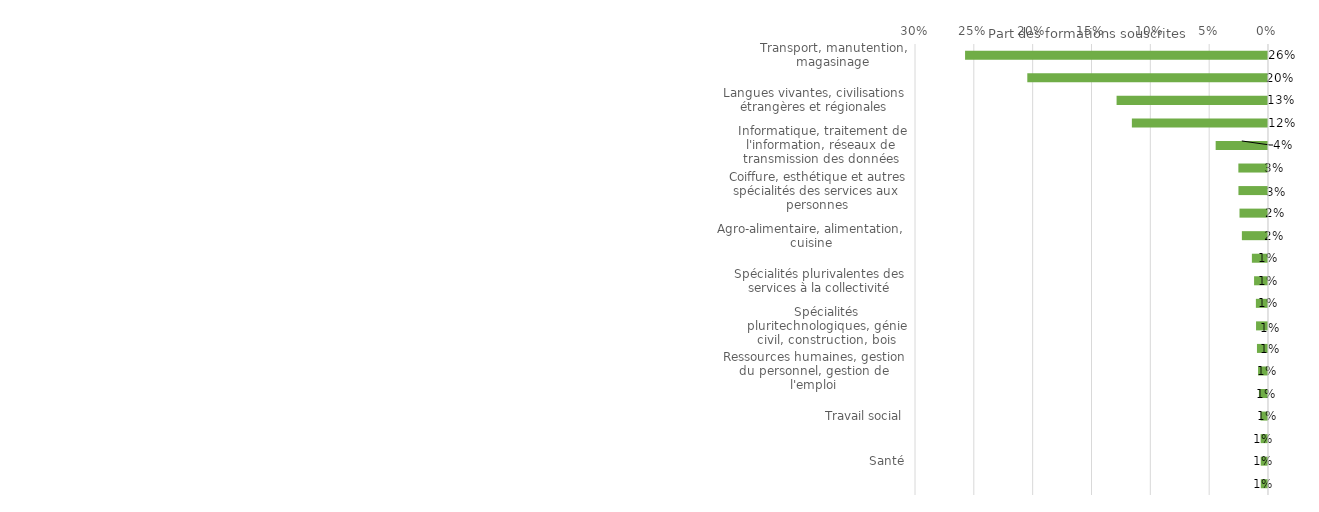
| Category | Series 0 |
|---|---|
| Transport, manutention, magasinage | 0.257 |
| Développement des capacités d'orientation, d'insertion ou de réinsertion | 0.205 |
| Langues vivantes, civilisations étrangères et régionales | 0.129 |
| Secrétariat, bureautique | 0.116 |
| Informatique, traitement de l'information, réseaux de transmission des données | 0.044 |
| Sécurité des biens et des personnes, police, surveillance | 0.025 |
| Coiffure, esthétique et autres spécialités des services aux personnes | 0.025 |
| Enseignement, formation | 0.024 |
| Agro-alimentaire, alimentation, cuisine | 0.022 |
| Spécialités plurivalentes des échanges et de la gestion | 0.014 |
| Spécialités plurivalentes des services à la collectivité | 0.012 |
| Finances, banque, assurances | 0.01 |
| Spécialités pluritechnologiques, génie civil, construction, bois | 0.01 |
| Commerce, vente | 0.009 |
| Ressources humaines, gestion du personnel, gestion de l'emploi | 0.008 |
| Comptabilité, gestion | 0.008 |
| Travail social | 0.006 |
| Spécialités plurivalentes sanitaires et sociales | 0.006 |
| Santé | 0.006 |
| Spécialité plurivalentes de la communication | 0.006 |